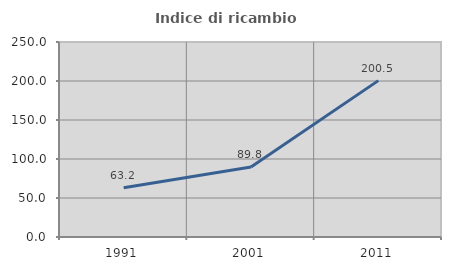
| Category | Indice di ricambio occupazionale  |
|---|---|
| 1991.0 | 63.19 |
| 2001.0 | 89.811 |
| 2011.0 | 200.483 |